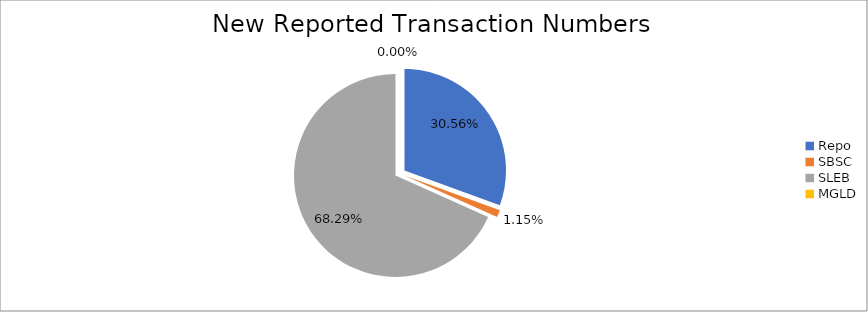
| Category | Series 0 |
|---|---|
| Repo | 306713 |
| SBSC | 11496 |
| SLEB | 685351 |
| MGLD | 49 |